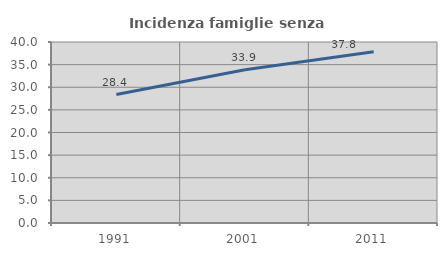
| Category | Incidenza famiglie senza nuclei |
|---|---|
| 1991.0 | 28.395 |
| 2001.0 | 33.861 |
| 2011.0 | 37.824 |